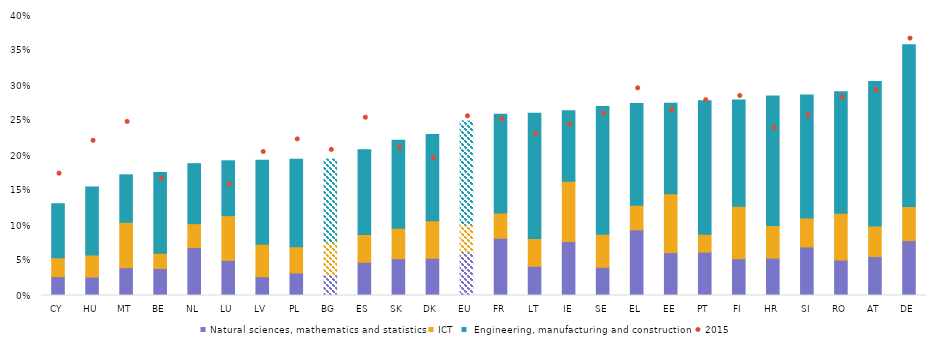
| Category | Natural sciences, mathematics and statistics | ICT |  Engineering, manufacturing and construction |
|---|---|---|---|
| CY | 0.027 | 0.027 | 0.077 |
| HU | 0.026 | 0.031 | 0.097 |
| MT | 0.04 | 0.065 | 0.068 |
| BE | 0.039 | 0.022 | 0.116 |
| NL | 0.068 | 0.034 | 0.086 |
| LU | 0.05 | 0.064 | 0.078 |
| LV | 0.027 | 0.046 | 0.12 |
| PL | 0.032 | 0.037 | 0.125 |
| BG | 0.029 | 0.046 | 0.119 |
| ES | 0.047 | 0.04 | 0.121 |
| SK | 0.053 | 0.044 | 0.126 |
| DK | 0.053 | 0.054 | 0.123 |
| EU | 0.062 | 0.039 | 0.148 |
| FR | 0.082 | 0.036 | 0.141 |
| LT | 0.042 | 0.04 | 0.179 |
| IE | 0.077 | 0.086 | 0.101 |
| SE | 0.04 | 0.047 | 0.183 |
| EL | 0.094 | 0.035 | 0.145 |
| EE | 0.061 | 0.084 | 0.13 |
| PT | 0.062 | 0.026 | 0.191 |
| FI | 0.052 | 0.075 | 0.152 |
| HR | 0.053 | 0.047 | 0.185 |
| SI | 0.069 | 0.041 | 0.176 |
| RO | 0.051 | 0.067 | 0.173 |
| AT | 0.056 | 0.044 | 0.207 |
| DE | 0.078 | 0.049 | 0.231 |